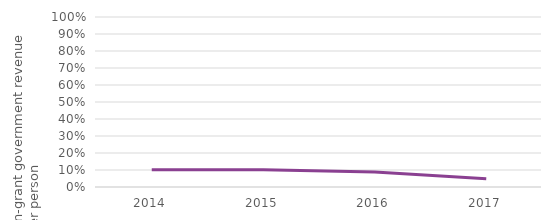
| Category | Less than 400 |
|---|---|
| 2014.0 | 0.101 |
| 2015.0 | 0.102 |
| 2016.0 | 0.088 |
| 2017.0 | 0.049 |